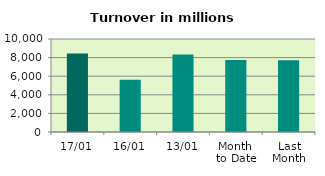
| Category | Series 0 |
|---|---|
| 17/01 | 8442.027 |
| 16/01 | 5630.586 |
| 13/01 | 8345.425 |
| Month 
to Date | 7749.769 |
| Last
Month | 7707.734 |